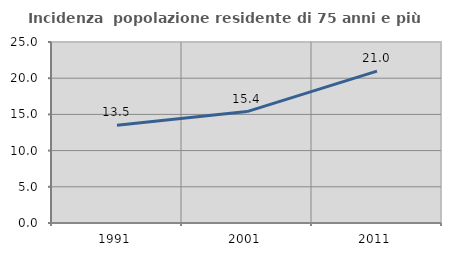
| Category | Incidenza  popolazione residente di 75 anni e più |
|---|---|
| 1991.0 | 13.514 |
| 2001.0 | 15.385 |
| 2011.0 | 20.976 |